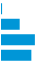
| Category | Series 0 |
|---|---|
| 0 | 0.001 |
| 1 | 0.221 |
| 2 | 0.411 |
| 3 | 0.367 |